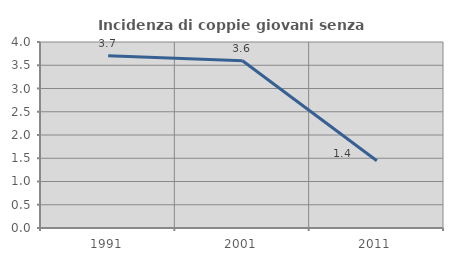
| Category | Incidenza di coppie giovani senza figli |
|---|---|
| 1991.0 | 3.704 |
| 2001.0 | 3.597 |
| 2011.0 | 1.446 |